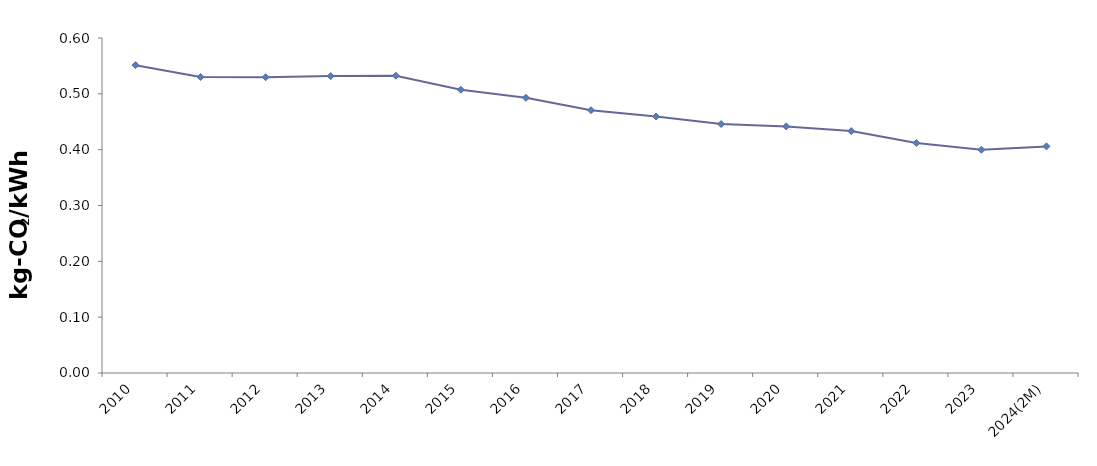
| Category | CO2/kWh
 (kg-CO2 / kWh) |
|---|---|
| 2010 | 0.551 |
| 2011 | 0.53 |
| 2012 | 0.53 |
| 2013 | 0.532 |
| 2014 | 0.532 |
| 2015 | 0.507 |
| 2016 | 0.493 |
| 2017 | 0.471 |
| 2018 | 0.459 |
| 2019 | 0.446 |
| 2020 | 0.442 |
| 2021 | 0.433 |
| 2022 | 0.412 |
| 2023 | 0.4 |
| 2024(2M) | 0.406 |